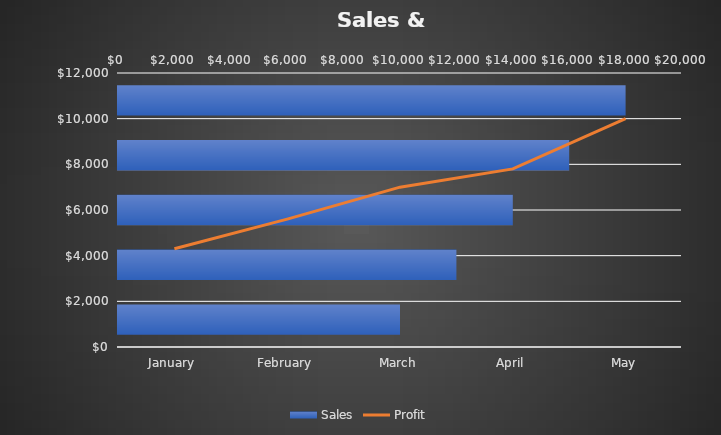
| Category | Sales |
|---|---|
| January | 10000 |
| February | 12000 |
| March | 14000 |
| April | 16000 |
| May | 18000 |